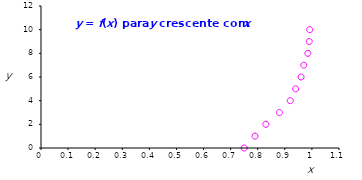
| Category | Series 0 |
|---|---|
| 0.75 | 0 |
| 0.79 | 1 |
| 0.83 | 2 |
| 0.88 | 3 |
| 0.92 | 4 |
| 0.94 | 5 |
| 0.96 | 6 |
| 0.97 | 7 |
| 0.985 | 8 |
| 0.99 | 9 |
| 0.992 | 10 |